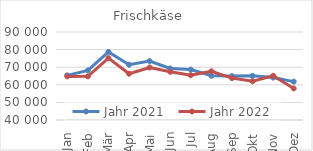
| Category | Jahr 2021 | Jahr 2022 |
|---|---|---|
| Jan | 65363.364 | 64773.221 |
| Feb | 68190.504 | 64792.523 |
| Mär | 78670.766 | 75175.818 |
| Apr | 71423.488 | 66285.836 |
| Mai | 73480.777 | 69843.014 |
| Jun | 69281.184 | 67362.8 |
| Jul | 68641.65 | 65447.33 |
| Aug | 65139.76 | 67681.625 |
| Sep | 64953.443 | 63820.734 |
| Okt | 65090.171 | 61990.169 |
| Nov | 64110.142 | 65138.806 |
| Dez | 61815.08 | 57920.715 |